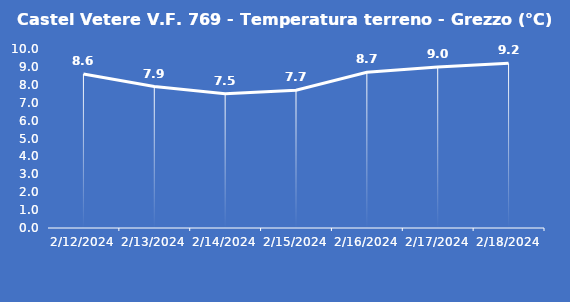
| Category | Castel Vetere V.F. 769 - Temperatura terreno - Grezzo (°C) |
|---|---|
| 2/12/24 | 8.6 |
| 2/13/24 | 7.9 |
| 2/14/24 | 7.5 |
| 2/15/24 | 7.7 |
| 2/16/24 | 8.7 |
| 2/17/24 | 9 |
| 2/18/24 | 9.2 |